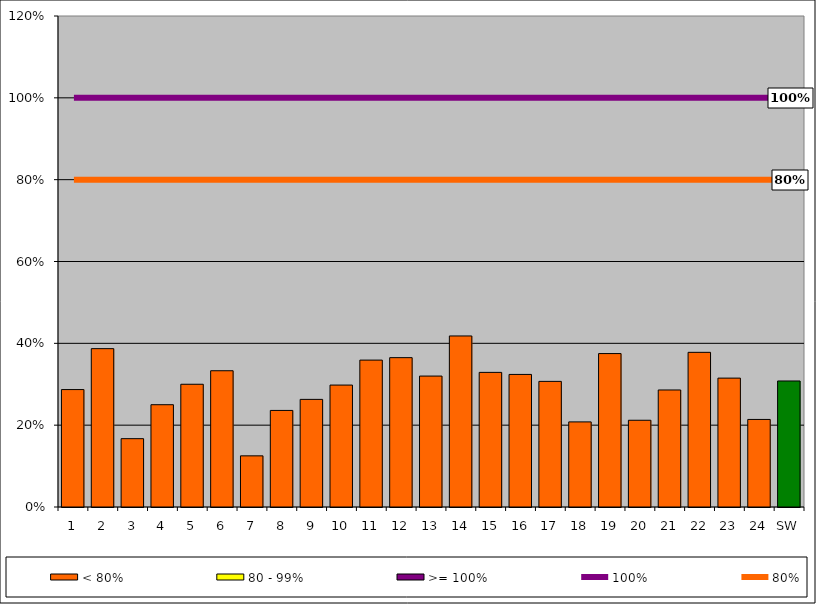
| Category | < 80% | 80 - 99% | >= 100% |
|---|---|---|---|
| 1 | 0.287 | 0 | 0 |
| 2 | 0.387 | 0 | 0 |
| 3 | 0.167 | 0 | 0 |
| 4 | 0.25 | 0 | 0 |
| 5 | 0.3 | 0 | 0 |
| 6 | 0.333 | 0 | 0 |
| 7 | 0.125 | 0 | 0 |
| 8 | 0.236 | 0 | 0 |
| 9 | 0.263 | 0 | 0 |
| 10 | 0.298 | 0 | 0 |
| 11 | 0.359 | 0 | 0 |
| 12 | 0.365 | 0 | 0 |
| 13 | 0.32 | 0 | 0 |
| 14 | 0.418 | 0 | 0 |
| 15 | 0.329 | 0 | 0 |
| 16 | 0.324 | 0 | 0 |
| 17 | 0.307 | 0 | 0 |
| 18 | 0.208 | 0 | 0 |
| 19 | 0.375 | 0 | 0 |
| 20 | 0.212 | 0 | 0 |
| 21 | 0.286 | 0 | 0 |
| 22 | 0.378 | 0 | 0 |
| 23 | 0.315 | 0 | 0 |
| 24 | 0.214 | 0 | 0 |
| SW | 0.308 | 0 | 0 |